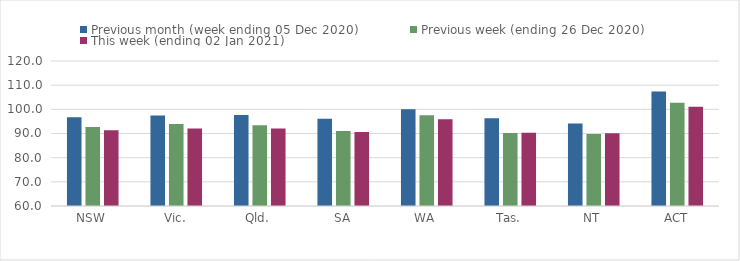
| Category | Previous month (week ending 05 Dec 2020) | Previous week (ending 26 Dec 2020) | This week (ending 02 Jan 2021) |
|---|---|---|---|
| NSW | 96.69 | 92.64 | 91.33 |
| Vic. | 97.44 | 93.91 | 92.1 |
| Qld. | 97.7 | 93.38 | 92.02 |
| SA | 96.15 | 91.03 | 90.59 |
| WA | 100.08 | 97.52 | 95.88 |
| Tas. | 96.3 | 90.22 | 90.35 |
| NT | 94.15 | 89.75 | 90.06 |
| ACT | 107.4 | 102.73 | 101.04 |